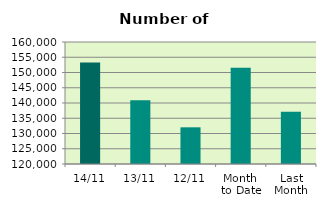
| Category | Series 0 |
|---|---|
| 14/11 | 153266 |
| 13/11 | 140862 |
| 12/11 | 132026 |
| Month 
to Date | 151571.8 |
| Last
Month | 137122.087 |